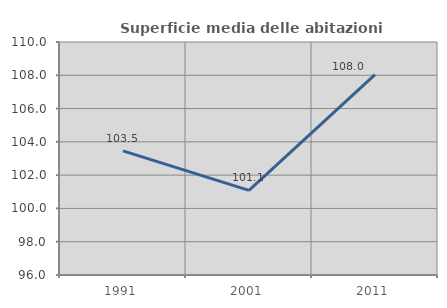
| Category | Superficie media delle abitazioni occupate |
|---|---|
| 1991.0 | 103.459 |
| 2001.0 | 101.086 |
| 2011.0 | 108.043 |